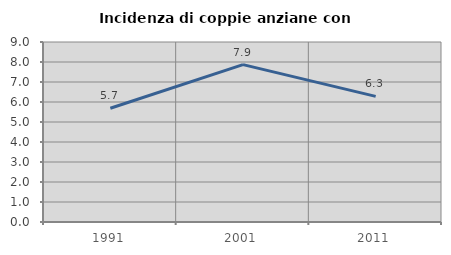
| Category | Incidenza di coppie anziane con figli |
|---|---|
| 1991.0 | 5.687 |
| 2001.0 | 7.87 |
| 2011.0 | 6.28 |